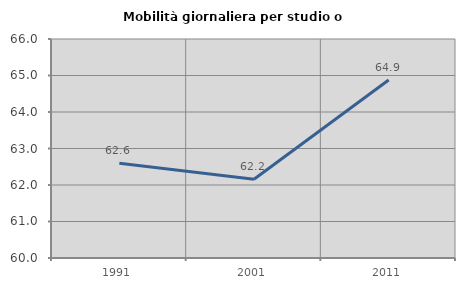
| Category | Mobilità giornaliera per studio o lavoro |
|---|---|
| 1991.0 | 62.597 |
| 2001.0 | 62.158 |
| 2011.0 | 64.877 |